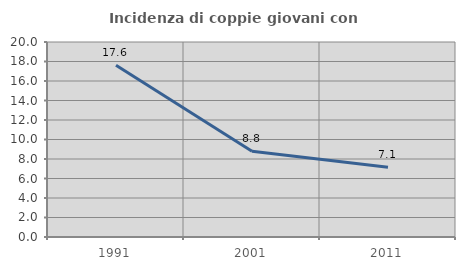
| Category | Incidenza di coppie giovani con figli |
|---|---|
| 1991.0 | 17.611 |
| 2001.0 | 8.797 |
| 2011.0 | 7.143 |